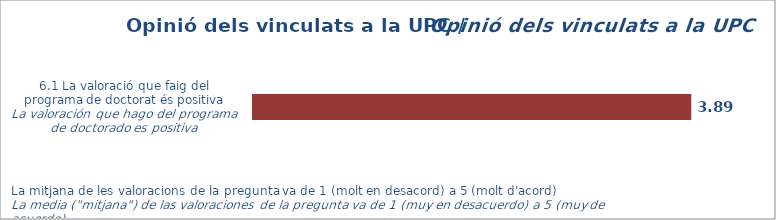
| Category | Mitjana |
|---|---|
| 0 | 3.89 |